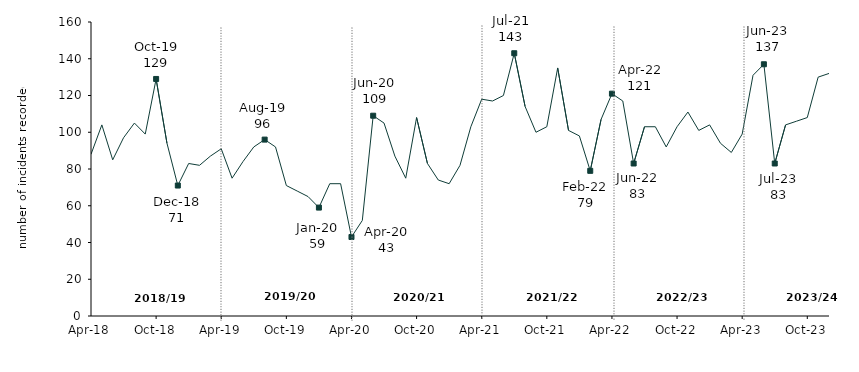
| Category | Series 0 |
|---|---|
| 2018-04-01 | 88 |
| 2018-05-01 | 104 |
| 2018-06-01 | 85 |
| 2018-07-01 | 97 |
| 2018-08-01 | 105 |
| 2018-09-01 | 99 |
| 2018-10-01 | 129 |
| 2018-11-01 | 94 |
| 2018-12-01 | 71 |
| 2019-01-01 | 83 |
| 2019-02-01 | 82 |
| 2019-03-01 | 87 |
| 2019-04-01 | 91 |
| 2019-05-01 | 75 |
| 2019-06-01 | 84 |
| 2019-07-01 | 92 |
| 2019-08-01 | 96 |
| 2019-09-01 | 92 |
| 2019-10-01 | 71 |
| 2019-11-01 | 68 |
| 2019-12-01 | 65 |
| 2020-01-01 | 59 |
| 2020-02-01 | 72 |
| 2020-03-01 | 72 |
| 2020-04-01 | 43 |
| 2020-05-01 | 52 |
| 2020-06-01 | 109 |
| 2020-07-01 | 105 |
| 2020-08-01 | 87 |
| 2020-09-01 | 75 |
| 2020-10-01 | 108 |
| 2020-11-01 | 83 |
| 2020-12-01 | 74 |
| 2021-01-01 | 72 |
| 2021-02-01 | 82 |
| 2021-03-01 | 103 |
| 2021-04-01 | 118 |
| 2021-05-01 | 117 |
| 2021-06-01 | 120 |
| 2021-07-01 | 143 |
| 2021-08-01 | 114 |
| 2021-09-01 | 100 |
| 2021-10-01 | 103 |
| 2021-11-01 | 135 |
| 2021-12-01 | 101 |
| 2022-01-01 | 98 |
| 2022-02-01 | 79 |
| 2022-03-01 | 107 |
| 2022-04-01 | 121 |
| 2022-05-01 | 117 |
| 2022-06-01 | 83 |
| 2022-07-01 | 103 |
| 2022-08-01 | 103 |
| 2022-09-01 | 92 |
| 2022-10-01 | 103 |
| 2022-11-01 | 111 |
| 2022-12-01 | 101 |
| 2023-01-01 | 104 |
| 2023-02-01 | 94 |
| 2023-03-01 | 89 |
| 2023-04-01 | 99 |
| 2023-05-01 | 131 |
| 2023-06-01 | 137 |
| 2023-07-01 | 83 |
| 2023-08-01 | 104 |
| 2023-09-01 | 106 |
| 2023-10-01 | 108 |
| 2023-11-01 | 130 |
| 2023-12-01 | 132 |